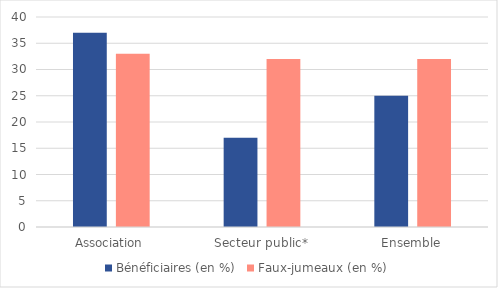
| Category | Bénéficiaires (en %) | Faux-jumeaux (en %) |
|---|---|---|
| Association | 37 | 33 |
| Secteur public* | 17 | 32 |
| Ensemble | 25 | 32 |